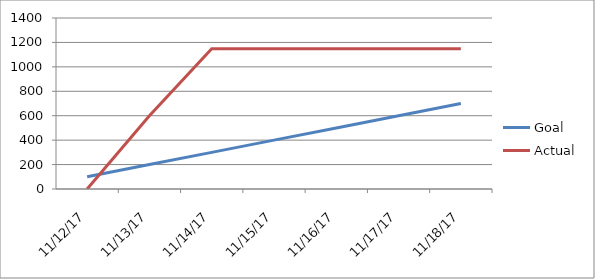
| Category | Goal | Actual |
|---|---|---|
| 2017-11-12 | 100 | 0 |
| 2017-11-13 | 200 | 599 |
| 2017-11-14 | 300 | 1148 |
| 2017-11-15 | 400 | 1148 |
| 2017-11-16 | 500 | 1148 |
| 2017-11-17 | 600 | 1148 |
| 2017-11-18 | 700 | 1148 |